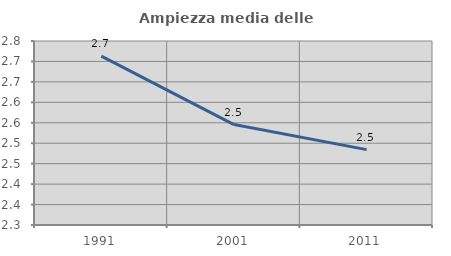
| Category | Ampiezza media delle famiglie |
|---|---|
| 1991.0 | 2.713 |
| 2001.0 | 2.546 |
| 2011.0 | 2.484 |